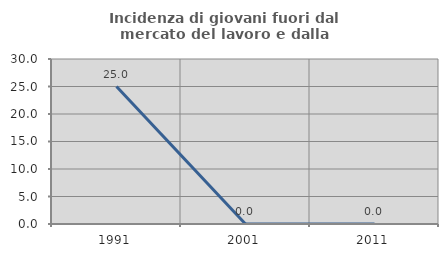
| Category | Incidenza di giovani fuori dal mercato del lavoro e dalla formazione  |
|---|---|
| 1991.0 | 25 |
| 2001.0 | 0 |
| 2011.0 | 0 |